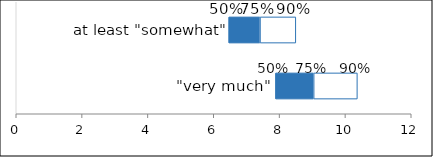
| Category | Series 0 | Series 1 | Series 2 |
|---|---|---|---|
| 0 | 7.878 | 1.158 | 1.328 |
| 1 | 6.457 | 0.949 | 1.088 |